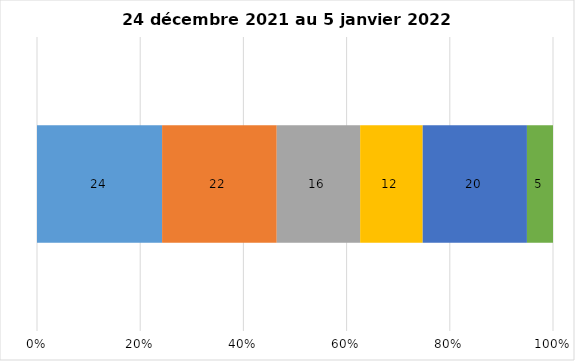
| Category | Plusieurs fois par jour | Une fois par jour | Quelques fois par semaine   | Une fois par semaine ou moins   |  Jamais   |  Je n’utilise pas les médias sociaux |
|---|---|---|---|---|---|---|
| 0 | 24 | 22 | 16 | 12 | 20 | 5 |